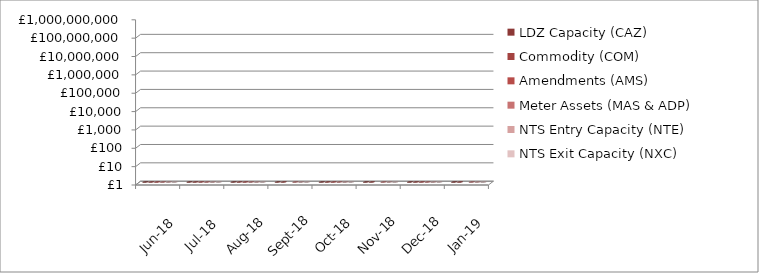
| Category | LDZ Capacity (CAZ) | Commodity (COM) | Amendments (AMS) | Meter Assets (MAS & ADP) | NTS Entry Capacity (NTE) | NTS Exit Capacity (NXC) |
|---|---|---|---|---|---|---|
| 2018-06-01 | 302299412.99 | 14591606.04 | 2213969.29 | 194233.54 | 1621553.61 | 18117525.2 |
| 2018-07-01 | 312562745.62 | 14290600.7 | 1483244.96 | 200707.69 | 1735803.71 | 18720256.49 |
| 2018-08-01 | 312780813.69 | 15048321.28 | 830443.17 | 200263.88 | 1735803.71 | 18720256.49 |
| 2018-09-01 | 302866760.19 | 17528307.3 | -385853.99 | 189788.22 | 1760935.51 | 18113875.74 |
| 2018-10-01 | 313359948.83 | 29476349.27 | 58182.64 | 196114.17 | 8332609.71 | 13807265.85 |
| 2018-11-01 | 303715362.33 | 37862420.69 | -765656.96 | 189786.88 | 8064487.69 | 13789980.96 |
| 2018-12-01 | 309858247 | 42951905.58 | 374357.97 | 196114.66 | 8796213.72 | 13770471.59 |
| 2019-01-01 | 310573206.23 | 52085770.33 | -1327183.91 | 196114.87 | 10143131.93 | 13947987.58 |